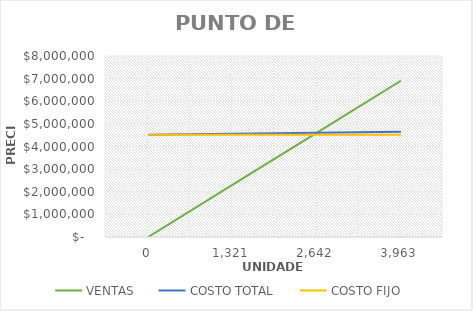
| Category | VENTAS | COSTO TOTAL | COSTO FIJO |
|---|---|---|---|
| 0.0 | 0 | 4517180.556 | 4517180.556 |
| 1320.8444076501983 | 2302231.803 | 4560822.08 | 4517180.556 |
| 2641.6888153003965 | 4604463.605 | 4604463.605 | 4517180.556 |
| 3962.533222950595 | 6906695.408 | 4648105.13 | 4517180.556 |